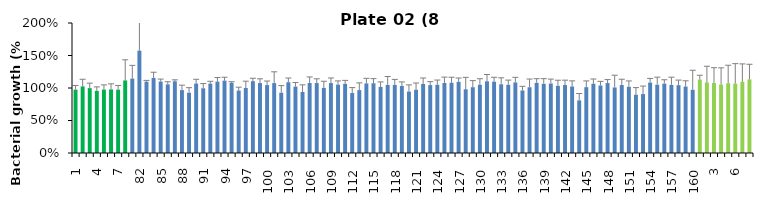
| Category | 8 h % |
|---|---|
| 1.0 | 0.975 |
| 2.0 | 1.025 |
| 3.0 | 0.998 |
| 4.0 | 0.956 |
| 5.0 | 0.976 |
| 6.0 | 0.978 |
| 7.0 | 0.975 |
| 8.0 | 1.117 |
| 81.0 | 1.145 |
| 82.0 | 1.575 |
| 83.0 | 1.097 |
| 84.0 | 1.155 |
| 85.0 | 1.099 |
| 86.0 | 1.056 |
| 87.0 | 1.104 |
| 88.0 | 0.968 |
| 89.0 | 0.927 |
| 90.0 | 1.069 |
| 91.0 | 0.995 |
| 92.0 | 1.068 |
| 93.0 | 1.098 |
| 94.0 | 1.113 |
| 95.0 | 1.081 |
| 96.0 | 0.961 |
| 97.0 | 1 |
| 98.0 | 1.105 |
| 99.0 | 1.076 |
| 100.0 | 1.045 |
| 101.0 | 1.075 |
| 102.0 | 0.927 |
| 103.0 | 1.089 |
| 104.0 | 1.021 |
| 105.0 | 0.939 |
| 106.0 | 1.077 |
| 107.0 | 1.076 |
| 108.0 | 1.002 |
| 109.0 | 1.076 |
| 110.0 | 1.052 |
| 111.0 | 1.064 |
| 112.0 | 0.922 |
| 113.0 | 0.968 |
| 114.0 | 1.071 |
| 115.0 | 1.073 |
| 116.0 | 1.017 |
| 117.0 | 1.047 |
| 118.0 | 1.047 |
| 119.0 | 1.031 |
| 120.0 | 0.945 |
| 121.0 | 0.972 |
| 122.0 | 1.062 |
| 123.0 | 1.045 |
| 124.0 | 1.049 |
| 125.0 | 1.077 |
| 126.0 | 1.081 |
| 127.0 | 1.095 |
| 128.0 | 0.981 |
| 129.0 | 1.012 |
| 130.0 | 1.049 |
| 131.0 | 1.103 |
| 132.0 | 1.097 |
| 133.0 | 1.058 |
| 134.0 | 1.049 |
| 135.0 | 1.085 |
| 136.0 | 0.962 |
| 137.0 | 1.011 |
| 138.0 | 1.079 |
| 139.0 | 1.064 |
| 140.0 | 1.069 |
| 141.0 | 1.033 |
| 142.0 | 1.046 |
| 143.0 | 1.023 |
| 144.0 | 0.81 |
| 145.0 | 1.013 |
| 146.0 | 1.065 |
| 147.0 | 1.038 |
| 148.0 | 1.076 |
| 149.0 | 1.008 |
| 150.0 | 1.046 |
| 151.0 | 1.019 |
| 152.0 | 0.896 |
| 153.0 | 0.906 |
| 154.0 | 1.084 |
| 155.0 | 1.05 |
| 156.0 | 1.067 |
| 157.0 | 1.047 |
| 158.0 | 1.044 |
| 159.0 | 1.022 |
| 160.0 | 0.972 |
| 1.0 | 1.129 |
| 2.0 | 1.086 |
| 3.0 | 1.077 |
| 4.0 | 1.053 |
| 5.0 | 1.073 |
| 6.0 | 1.067 |
| 7.0 | 1.097 |
| 8.0 | 1.133 |